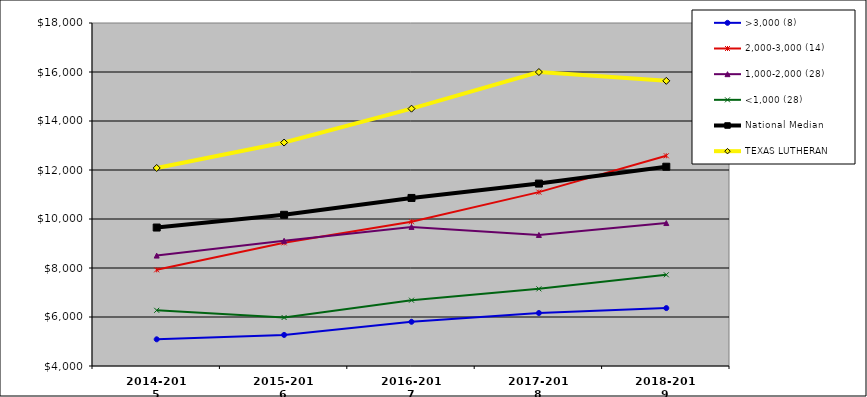
| Category | >3,000 (8) | 2,000-3,000 (14) | 1,000-2,000 (28) | <1,000 (28) | National Median | TEXAS LUTHERAN |
|---|---|---|---|---|---|---|
| 2014-2015 | 5089.532 | 7925.01 | 8506.708 | 6273.517 | 9651.331 | 12082.598 |
| 2015-2016 | 5268.443 | 9026.819 | 9110.756 | 5979.127 | 10170.953 | 13120.524 |
| 2016-2017 | 5804.661 | 9888.366 | 9677.108 | 6685.602 | 10859.41 | 14503.602 |
| 2017-2018 | 6162.79 | 11096.178 | 9349.006 | 7148.257 | 11445.61 | 15999.237 |
| 2018-2019 | 6363.735 | 12579.859 | 9835.328 | 7722.998 | 12133.725 | 15639.308 |